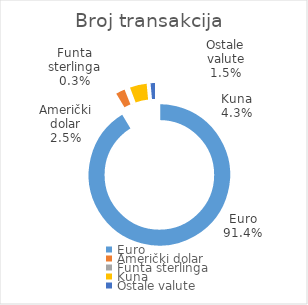
| Category | Broj transakcija  |
|---|---|
| Euro | 6324635 |
| Američki dolar | 174737 |
| Funta sterlinga | 20535 |
| Kuna | 297553 |
| Ostale valute | 100575 |